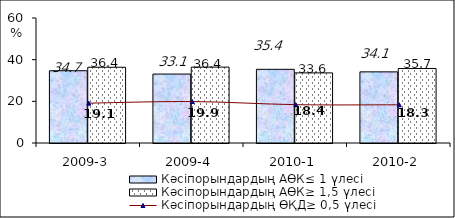
| Category | Кәсіпорындардың АӨК≤ 1 үлесі | Кәсіпорындардың АӨК≥ 1,5 үлесі |
|---|---|---|
| 2009-3 | 34.694 | 36.355 |
| 2009-4 | 33.091 | 36.421 |
| 2010-1 | 35.369 | 33.647 |
| 2010-2 | 34.143 | 35.746 |